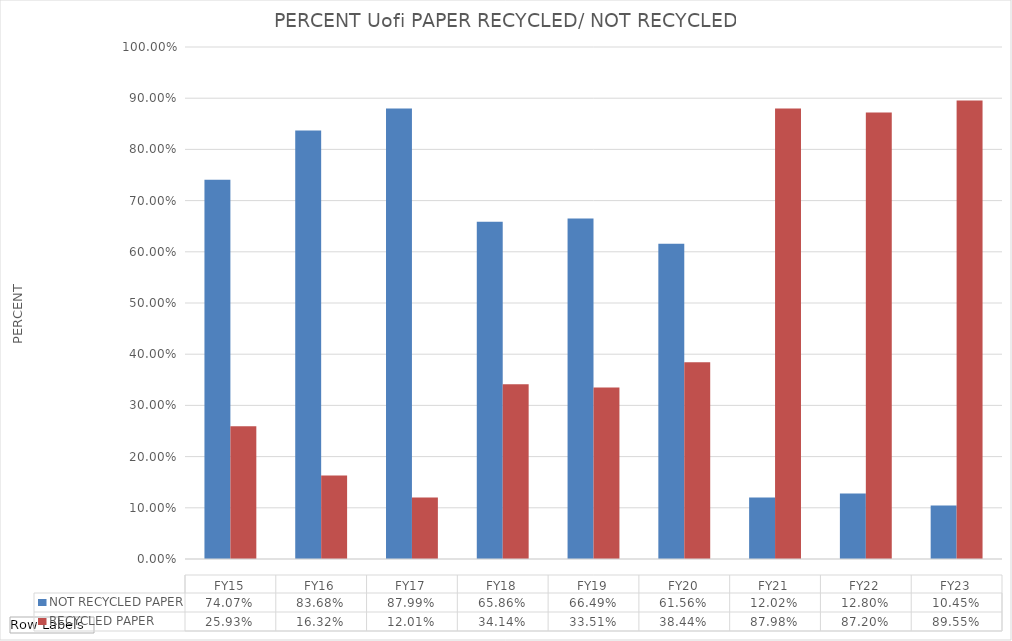
| Category | NOT RECYCLED PAPER | RECYCLED PAPER |
|---|---|---|
| FY15 | 0.741 | 0.259 |
| FY16 | 0.837 | 0.163 |
| FY17 | 0.88 | 0.12 |
| FY18 | 0.659 | 0.341 |
| FY19 | 0.665 | 0.335 |
| FY20 | 0.616 | 0.384 |
| FY21 | 0.12 | 0.88 |
| FY22 | 0.128 | 0.872 |
| FY23 | 0.105 | 0.895 |